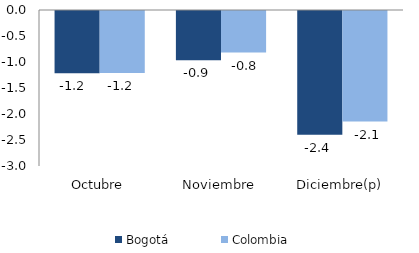
| Category | Bogotá | Colombia |
|---|---|---|
| Octubre | -1.195 | -1.193 |
| Noviembre | -0.947 | -0.799 |
| Diciembre(p) | -2.382 | -2.125 |